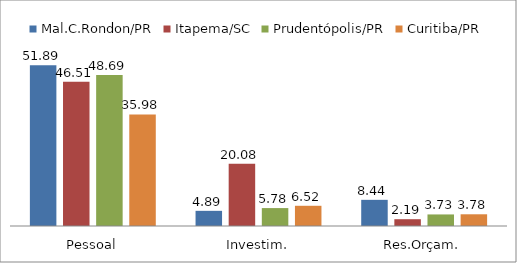
| Category | Mal.C.Rondon/PR | Itapema/SC | Prudentópolis/PR | Toledo/PR | Cascavel/PR | Curitiba/PR |
|---|---|---|---|---|---|---|
| Pessoal | 51.89 | 46.51 | 48.69 |  |  | 35.98 |
| Investim. | 4.89 | 20.08 | 5.78 |  |  | 6.52 |
| Res.Orçam. | 8.44 | 2.19 | 3.73 |  |  | 3.78 |